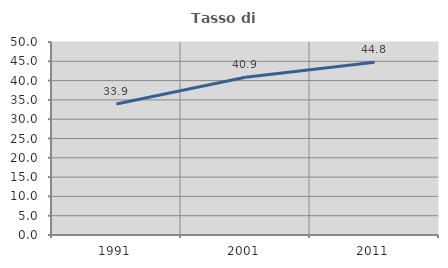
| Category | Tasso di occupazione   |
|---|---|
| 1991.0 | 33.938 |
| 2001.0 | 40.86 |
| 2011.0 | 44.776 |